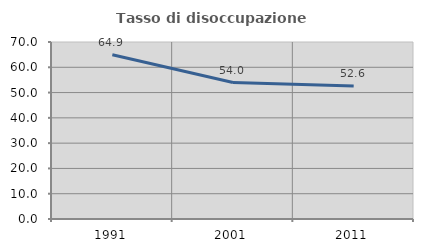
| Category | Tasso di disoccupazione giovanile  |
|---|---|
| 1991.0 | 64.925 |
| 2001.0 | 53.953 |
| 2011.0 | 52.577 |